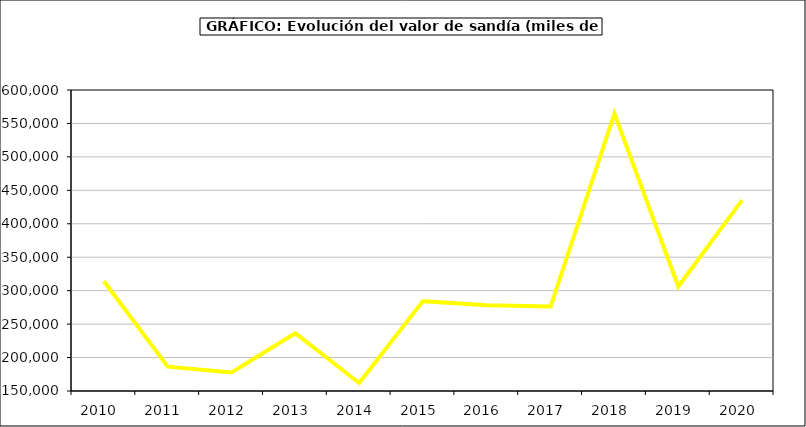
| Category | Valor |
|---|---|
| 2010.0 | 314067.402 |
| 2011.0 | 186441.033 |
| 2012.0 | 177750.096 |
| 2013.0 | 236329.828 |
| 2014.0 | 161950.328 |
| 2015.0 | 284357 |
| 2016.0 | 278370 |
| 2017.0 | 276294.254 |
| 2018.0 | 564662.077 |
| 2019.0 | 306143.724 |
| 2020.0 | 435408.11 |